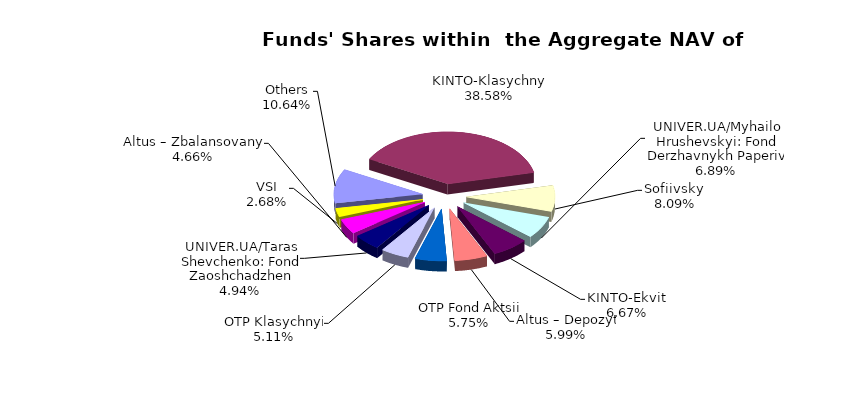
| Category | Series 0 | Series 1 |
|---|---|---|
| Others | 6484405.28 | 0.106 |
| KINTO-Klasychnyi | 23515065.84 | 0.386 |
| Sofiivskyi | 4930359.81 | 0.081 |
| UNIVER.UA/Myhailo Hrushevskyi: Fond Derzhavnykh Paperiv | 4199586.31 | 0.069 |
| KINTO-Ekviti | 4066141.41 | 0.067 |
| Altus – Depozyt | 3648847.24 | 0.06 |
| OTP Fond Aktsii | 3504707.03 | 0.057 |
| ОТP Klasychnyi | 3116145.65 | 0.051 |
| UNIVER.UA/Taras Shevchenko: Fond Zaoshchadzhen | 3013790.91 | 0.049 |
| Altus – Zbalansovanyi | 2839574.64 | 0.047 |
| VSI | 1636513.49 | 0.027 |